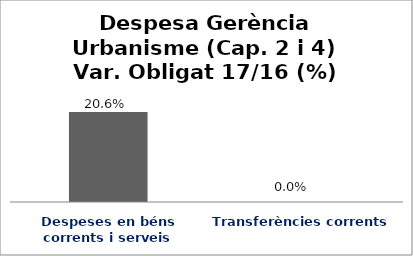
| Category | Series 0 |
|---|---|
| Despeses en béns corrents i serveis | 0.206 |
| Transferències corrents | 0 |